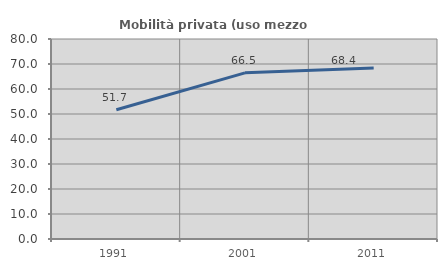
| Category | Mobilità privata (uso mezzo privato) |
|---|---|
| 1991.0 | 51.682 |
| 2001.0 | 66.469 |
| 2011.0 | 68.427 |